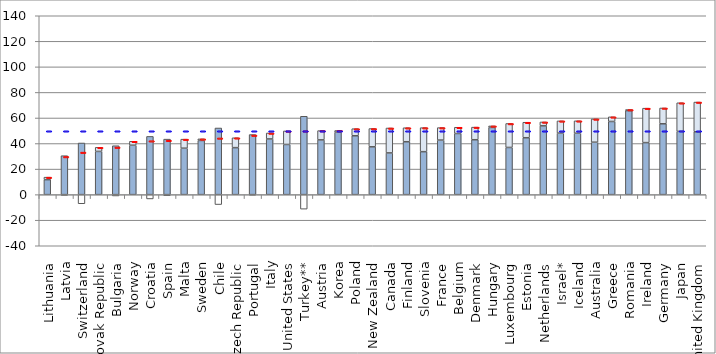
| Category | Gross Earnings | Net taxes | Net transfers |
|---|---|---|---|
| Lithuania | 11.729 | 0 | 1.964 |
| Latvia | 30.48 | -0.596 | 0 |
| Switzerland | 40.417 | -7.133 | 0 |
| Slovak Republic | 33.831 | 0 | 3.206 |
| Bulgaria | 38.275 | -1.05 | 0 |
| Norway | 38.668 | 0 | 3.11 |
| Croatia | 45.576 | -3.366 | 0 |
| Spain | 43.454 | -0.849 | 0 |
| Malta | 36.353 | 0 | 7.075 |
| Sweden | 42.414 | 0 | 1.237 |
| Chile | 52.159 | -7.773 | 0 |
| Czech Republic | 36.793 | 0 | 7.71 |
| Portugal | 47.026 | -0.389 | 0 |
| Italy | 43.581 | 0 | 4.679 |
| United States | 39.273 | 0 | 10.596 |
| Turkey** | 61.339 | -11.355 | 0 |
| Austria | 42.856 | 0 | 7.268 |
| Korea | 48.851 | 0 | 1.369 |
| Poland | 46.081 | 0 | 5.542 |
| New Zealand | 37.438 | 0 | 14.293 |
| Canada | 32.67 | 0 | 19.491 |
| Finland | 41.413 | 0 | 10.957 |
| Slovenia | 33.632 | 0 | 18.79 |
| France | 42.699 | 0 | 9.763 |
| Belgium | 47.857 | 0 | 4.885 |
| Denmark | 42.974 | 0 | 9.863 |
| Hungary | 52.595 | 0 | 1.186 |
| Luxembourg | 36.929 | 0 | 18.767 |
| Estonia | 44.541 | 0 | 12.132 |
| Netherlands | 53.841 | 0 | 3.054 |
| Israel* | 48.166 | 0 | 9.567 |
| Iceland | 48.052 | 0 | 9.732 |
| Australia | 41.044 | 0 | 18.208 |
| Greece | 57.26 | 0 | 3.633 |
| Romania | 65.752 | 0 | 0.823 |
| Ireland | 40.723 | 0 | 26.951 |
| Germany | 55.466 | 0 | 12.362 |
| Japan | 49.515 | 0 | 22.38 |
| United Kingdom | 49.204 | 0 | 23.253 |